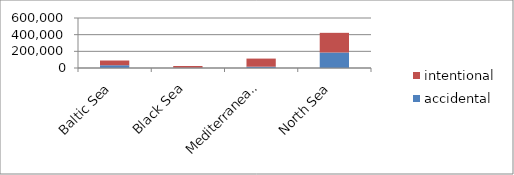
| Category | accidental | intentional |
|---|---|---|
| Baltic Sea | 33172.75 | 56730.5 |
| Black Sea | 3225.5 | 20937.75 |
| Mediterranean Sea | 15870 | 97038.75 |
| North Sea | 185947 | 236046.75 |